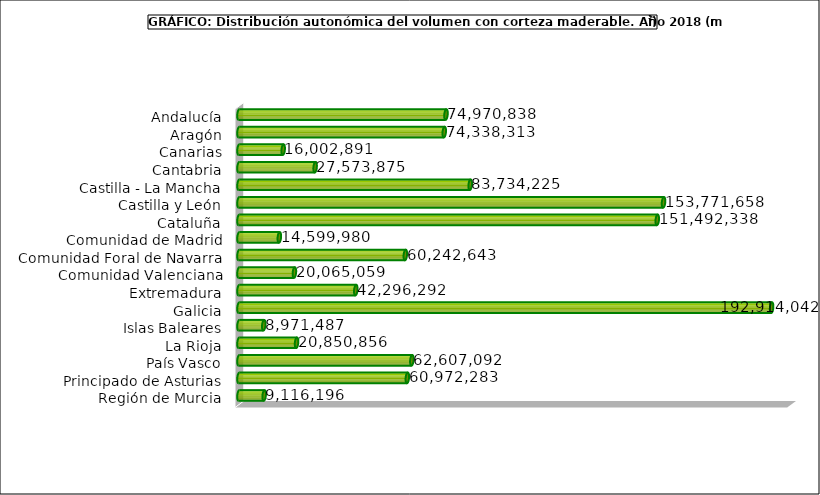
| Category | Series 0 |
|---|---|
| Andalucía | 74970838 |
| Aragón | 74338313 |
| Canarias | 16002890.735 |
| Cantabria | 27573875 |
| Castilla - La Mancha | 83734225 |
| Castilla y León | 153771658 |
| Cataluña | 151492338.266 |
| Comunidad de Madrid | 14599980 |
| Comunidad Foral de Navarra | 60242643 |
| Comunidad Valenciana | 20065059 |
| Extremadura | 42296292.208 |
| Galicia | 192914042 |
| Islas Baleares | 8971487 |
| La Rioja | 20850856 |
| País Vasco | 62607092 |
| Principado de Asturias | 60972283 |
| Región de Murcia | 9116196 |